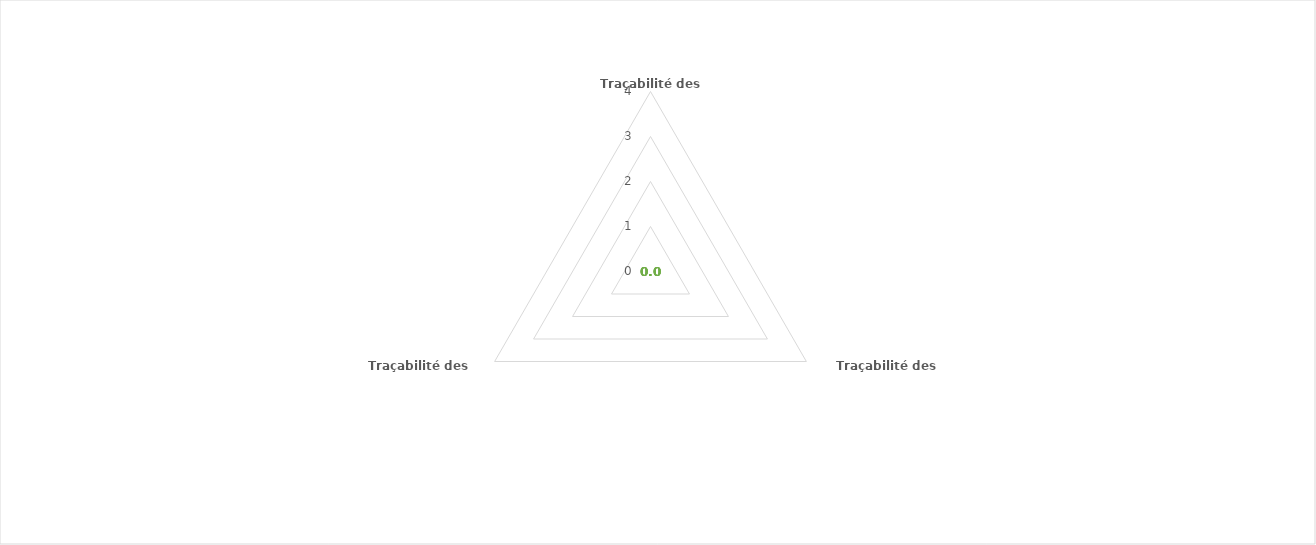
| Category | Series 0 |
|---|---|
| Traçabilité des acteurs | 0 |
| Traçabilité des opérations | 0 |
| Traçabilité des contrôles | 0 |